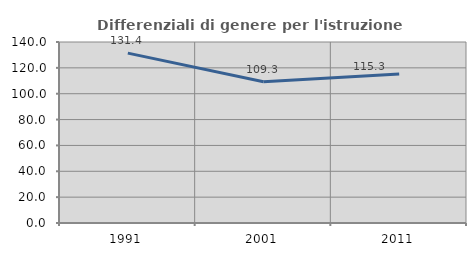
| Category | Differenziali di genere per l'istruzione superiore |
|---|---|
| 1991.0 | 131.391 |
| 2001.0 | 109.296 |
| 2011.0 | 115.333 |